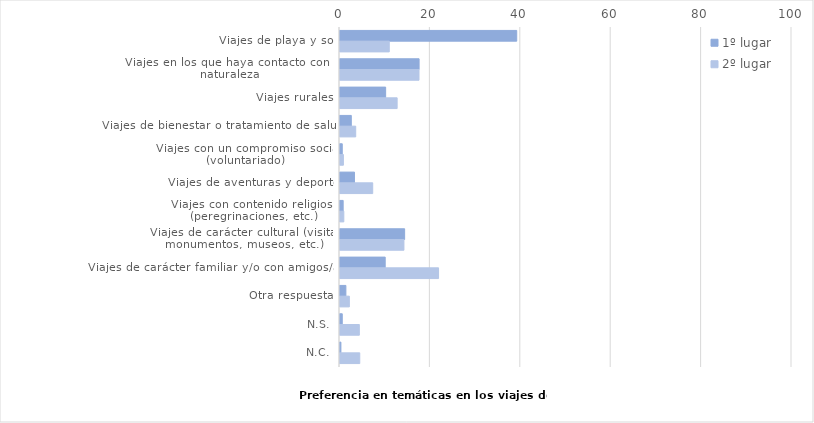
| Category | 1º lugar | 2º lugar |
|---|---|---|
| Viajes de playa y sol | 39.1 | 10.902 |
| Viajes en los que haya contacto con la naturaleza | 17.5 | 17.481 |
| Viajes rurales | 10.1 | 12.641 |
| Viajes de bienestar o tratamiento de salud | 2.5 | 3.477 |
| Viajes con un compromiso social (voluntariado) | 0.5 | 0.752 |
| Viajes de aventuras y deporte | 3.2 | 7.237 |
| Viajes con contenido religioso (peregrinaciones, etc.) | 0.7 | 0.846 |
| Viajes de carácter cultural (visitar monumentos, museos, etc.) | 14.3 | 14.145 |
| Viajes de carácter familiar y/o con amigos/as | 10 | 21.805 |
| Otra respuesta | 1.3 | 2.068 |
| N.S. | 0.5 | 4.276 |
| N.C. | 0.2 | 4.37 |